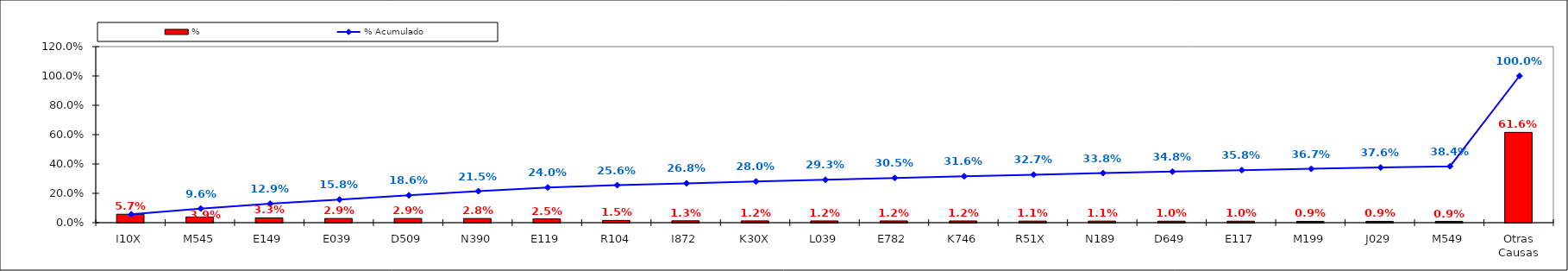
| Category | % |
|---|---|
| I10X | 0.057 |
| M545 | 0.039 |
| E149 | 0.033 |
| E039 | 0.029 |
| D509 | 0.029 |
| N390 | 0.028 |
| E119 | 0.025 |
| R104 | 0.015 |
| I872 | 0.013 |
| K30X | 0.012 |
| L039 | 0.012 |
| E782 | 0.012 |
| K746 | 0.012 |
| R51X | 0.011 |
| N189 | 0.011 |
| D649 | 0.01 |
| E117 | 0.01 |
| M199 | 0.009 |
| J029 | 0.009 |
| M549 | 0.009 |
| Otras Causas | 0.616 |